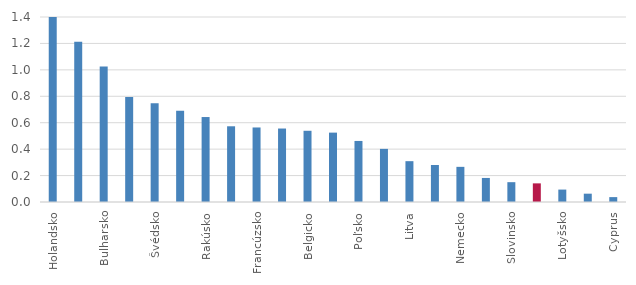
| Category | Series 0 |
|---|---|
| Holandsko | 1.413 |
| Dánsko | 1.212 |
| Bulharsko | 1.026 |
| Španielsko | 0.795 |
| Švédsko | 0.747 |
| Fínsko | 0.69 |
| Rakúsko | 0.643 |
| Portugalsko | 0.573 |
| Francúzsko | 0.564 |
| Chorvátsko | 0.556 |
| Belgicko | 0.539 |
| Luxembursko | 0.525 |
| Poľsko | 0.462 |
| Estónsko | 0.402 |
| Litva | 0.309 |
| Maďarsko | 0.28 |
| Nemecko | 0.266 |
| Česká republika | 0.182 |
| Slovinsko | 0.15 |
| Slovensko | 0.141 |
| Lotyšsko | 0.094 |
| Malta | 0.063 |
| Cyprus | 0.037 |